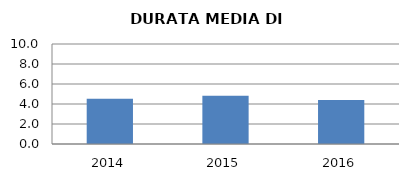
| Category | 2014 2015 2016 |
|---|---|
| 2014.0 | 4.519 |
| 2015.0 | 4.827 |
| 2016.0 | 4.393 |